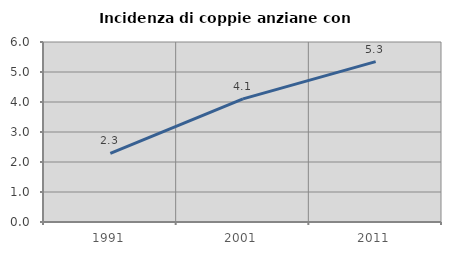
| Category | Incidenza di coppie anziane con figli |
|---|---|
| 1991.0 | 2.286 |
| 2001.0 | 4.106 |
| 2011.0 | 5.346 |